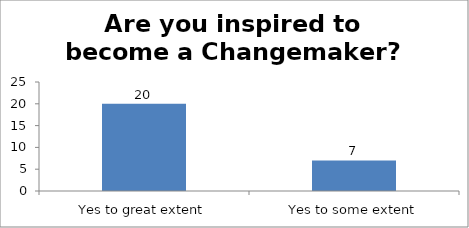
| Category | Are you inspired to become a Changemaker?   |
|---|---|
| Yes to great extent | 20 |
| Yes to some extent | 7 |